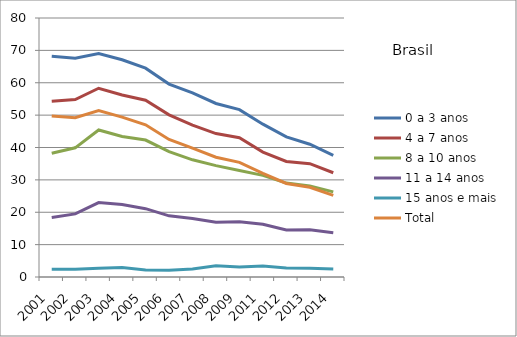
| Category | 0 a 3 anos | 4 a 7 anos | 8 a 10 anos | 11 a 14 anos | 15 anos e mais | Total |
|---|---|---|---|---|---|---|
| 2001.0 | 68.2 | 54.3 | 38.2 | 18.4 | 2.4 | 49.7 |
| 2002.0 | 67.6 | 54.8 | 39.9 | 19.5 | 2.4 | 49.2 |
| 2003.0 | 69 | 58.3 | 45.4 | 23 | 2.7 | 51.4 |
| 2004.0 | 67.1 | 56.2 | 43.4 | 22.4 | 2.9 | 49.4 |
| 2005.0 | 64.5 | 54.6 | 42.3 | 21.1 | 2.2 | 47 |
| 2006.0 | 59.6 | 50.1 | 38.7 | 18.9 | 2.1 | 42.5 |
| 2007.0 | 56.9 | 46.9 | 36.2 | 18.1 | 2.5 | 39.8 |
| 2008.0 | 53.6 | 44.3 | 34.4 | 16.9 | 3.5 | 37 |
| 2009.0 | 51.7 | 43 | 32.9 | 17.1 | 3.1 | 35.4 |
| 2011.0 | 47.2 | 38.6 | 31.4 | 16.3 | 3.4 | 32 |
| 2012.0 | 43.3 | 35.7 | 29 | 14.5 | 2.8 | 28.9 |
| 2013.0 | 41 | 35 | 28.1 | 14.6 | 2.7 | 27.7 |
| 2014.0 | 37.6 | 32.2 | 26.3 | 13.7 | 2.5 | 25.2 |